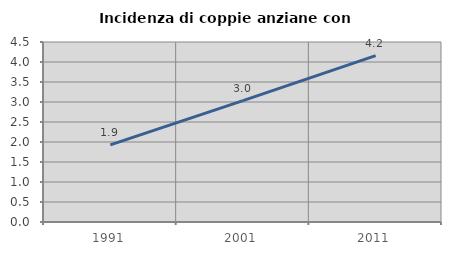
| Category | Incidenza di coppie anziane con figli |
|---|---|
| 1991.0 | 1.929 |
| 2001.0 | 3.035 |
| 2011.0 | 4.161 |